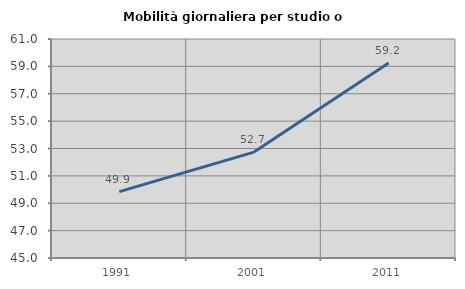
| Category | Mobilità giornaliera per studio o lavoro |
|---|---|
| 1991.0 | 49.851 |
| 2001.0 | 52.737 |
| 2011.0 | 59.239 |